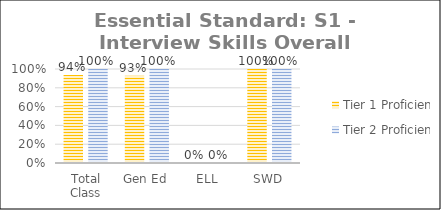
| Category | Tier 1 Proficiency | Tier 2 Proficiency |
|---|---|---|
| Total Class | 0.938 | 1 |
| Gen Ed | 0.929 | 1 |
| ELL | 0 | 0 |
| SWD | 1 | 1 |